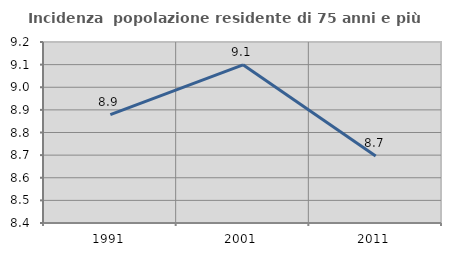
| Category | Incidenza  popolazione residente di 75 anni e più |
|---|---|
| 1991.0 | 8.879 |
| 2001.0 | 9.099 |
| 2011.0 | 8.696 |